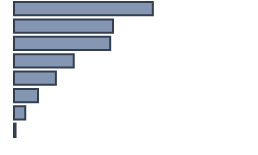
| Category | Percentatge |
|---|---|
| 0 | 57.847 |
| 1 | 41.253 |
| 2 | 40.075 |
| 3 | 24.888 |
| 4 | 17.454 |
| 5 | 9.991 |
| 6 | 4.72 |
| 7 | 0.648 |